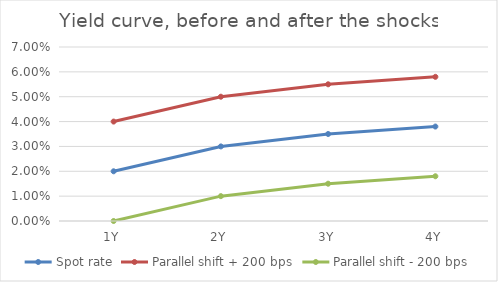
| Category | Spot rate | Parallel shift + 200 bps | Parallel shift - 200 bps |
|---|---|---|---|
| 1Y | 0.02 | 0.04 | 0 |
| 2Y | 0.03 | 0.05 | 0.01 |
| 3Y | 0.035 | 0.055 | 0.015 |
| 4Y | 0.038 | 0.058 | 0.018 |